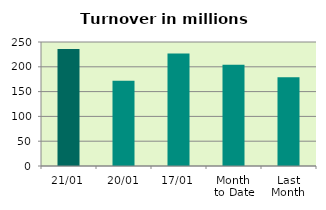
| Category | Series 0 |
|---|---|
| 21/01 | 235.703 |
| 20/01 | 171.765 |
| 17/01 | 226.673 |
| Month 
to Date | 204.129 |
| Last
Month | 179.047 |